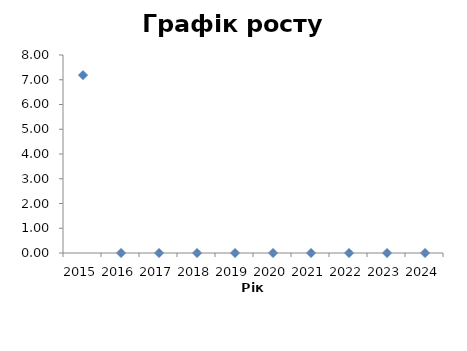
| Category | Series 0 |
|---|---|
| 2015.0 | 7.188 |
| 2016.0 | 0 |
| 2017.0 | 0 |
| 2018.0 | 0 |
| 2019.0 | 0 |
| 2020.0 | 0 |
| 2021.0 | 0 |
| 2022.0 | 0 |
| 2023.0 | 0 |
| 2024.0 | 0 |